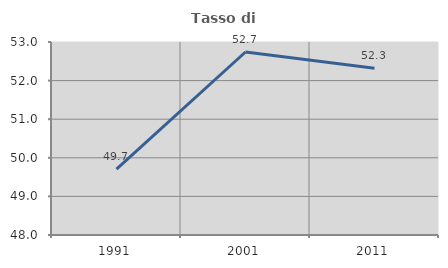
| Category | Tasso di occupazione   |
|---|---|
| 1991.0 | 49.706 |
| 2001.0 | 52.741 |
| 2011.0 | 52.318 |